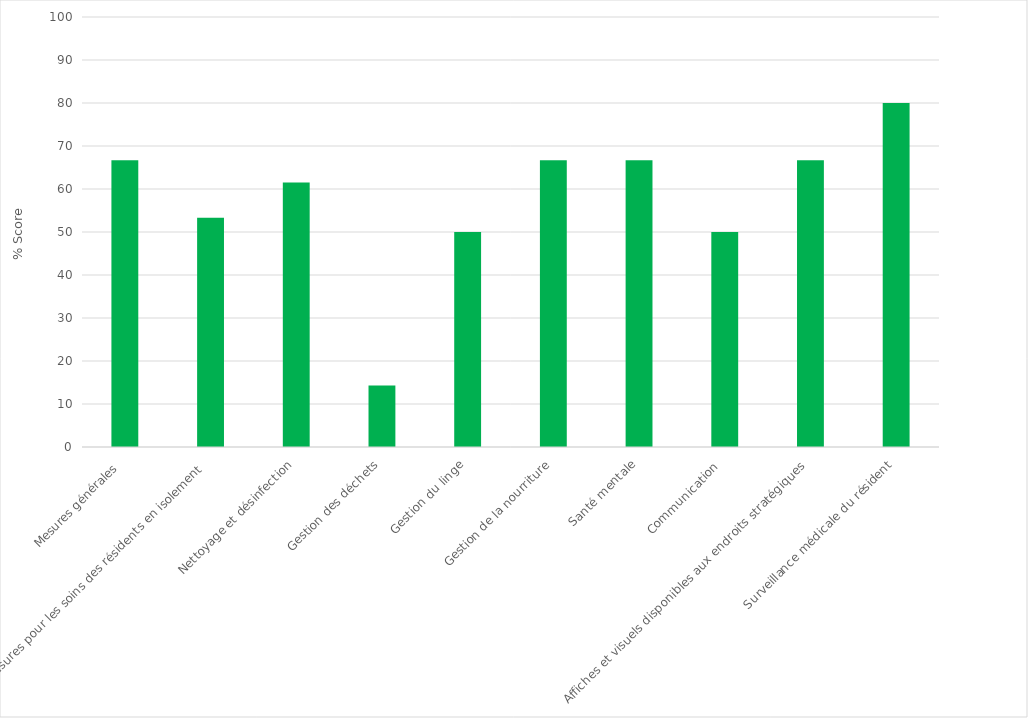
| Category | Series 0 |
|---|---|
| Mesures générales  | 66.667 |
| Mesures pour les soins des résidents en isolement  | 53.333 |
| Nettoyage et désinfection | 61.538 |
| Gestion des déchets | 14.286 |
| Gestion du linge | 50 |
| Gestion de la nourriture | 66.667 |
| Santé mentale | 66.667 |
| Communication  | 50 |
| Affiches et visuels disponibles aux endroits stratégiques | 66.667 |
| Surveillance médicale du résident | 80 |